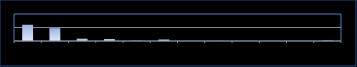
| Category | Series 0 |
|---|---|
| Jan 15 | 2399 |
| Feb 15 | 1901 |
| Mar 15 | 335 |
| Apr 15 | 297 |
| May 15 | 31 |
| Jun 15 | 212 |
| Jul 15 | 0 |
| Aug 15 | 15 |
| Sep 15 | 1 |
| Oct 15 | 4 |
| Nov 15 | 0 |
| Dec 15 | 75 |